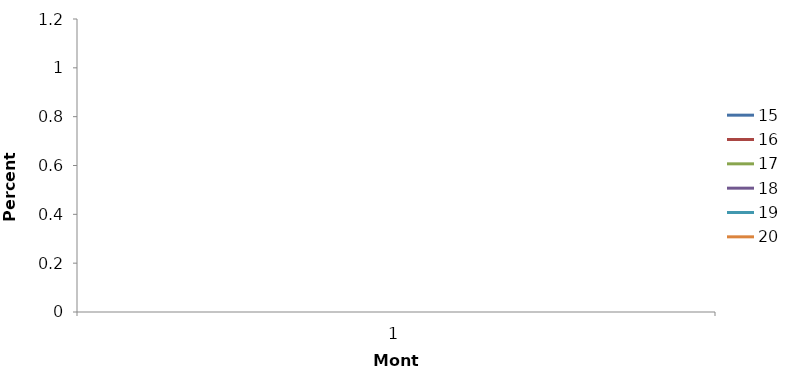
| Category | 15 | 16 | 17 | 18 | 19 | 20 |
|---|---|---|---|---|---|---|
| 0 | 1 | 1 | 1 | 1 | 1 | 1 |